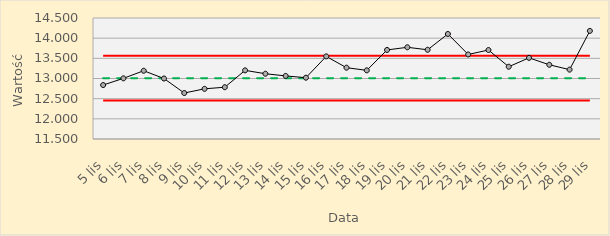
| Category | Series 0 | Series 1 | Series 2 | Series 3 |
|---|---|---|---|---|
| 2018-11-05 | 13.008 | 13.564 | 12.453 | 12.838 |
| 2018-11-06 | 13.008 | 13.564 | 12.453 | 13.004 |
| 2018-11-07 | 13.008 | 13.564 | 12.453 | 13.192 |
| 2018-11-08 | 13.008 | 13.564 | 12.453 | 13 |
| 2018-11-09 | 13.008 | 13.564 | 12.453 | 12.64 |
| 2018-11-10 | 13.008 | 13.564 | 12.453 | 12.744 |
| 2018-11-11 | 13.008 | 13.564 | 12.453 | 12.784 |
| 2018-11-12 | 13.008 | 13.564 | 12.453 | 13.202 |
| 2018-11-13 | 13.008 | 13.564 | 12.453 | 13.118 |
| 2018-11-14 | 13.008 | 13.564 | 12.453 | 13.064 |
| 2018-11-15 | 13.008 | 13.564 | 12.453 | 13.02 |
| 2018-11-16 | 13.008 | 13.564 | 12.453 | 13.548 |
| 2018-11-17 | 13.008 | 13.564 | 12.453 | 13.268 |
| 2018-11-18 | 13.008 | 13.564 | 12.453 | 13.202 |
| 2018-11-19 | 13.008 | 13.564 | 12.453 | 13.708 |
| 2018-11-20 | 13.008 | 13.564 | 12.453 | 13.774 |
| 2018-11-21 | 13.008 | 13.564 | 12.453 | 13.712 |
| 2018-11-22 | 13.008 | 13.564 | 12.453 | 14.104 |
| 2018-11-23 | 13.008 | 13.564 | 12.453 | 13.596 |
| 2018-11-24 | 13.008 | 13.564 | 12.453 | 13.706 |
| 2018-11-25 | 13.008 | 13.564 | 12.453 | 13.292 |
| 2018-11-26 | 13.008 | 13.564 | 12.453 | 13.512 |
| 2018-11-27 | 13.008 | 13.564 | 12.453 | 13.34 |
| 2018-11-28 | 13.008 | 13.564 | 12.453 | 13.22 |
| 2018-11-29 | 13.008 | 13.564 | 12.453 | 14.18 |